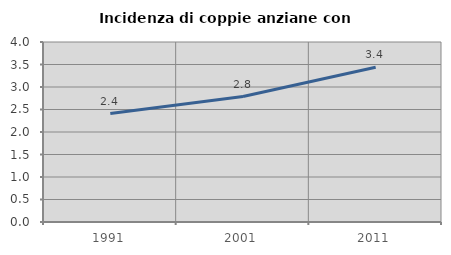
| Category | Incidenza di coppie anziane con figli |
|---|---|
| 1991.0 | 2.411 |
| 2001.0 | 2.787 |
| 2011.0 | 3.438 |